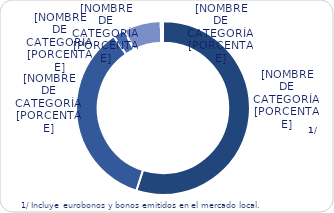
| Category | Series 0 |
|---|---|
| Inversionistas | 8456.5 |
| Multilateral | 5453.7 |
| Bilateral | 342.3 |
| BCR | 1065.7 |
| Otros | 65.2 |